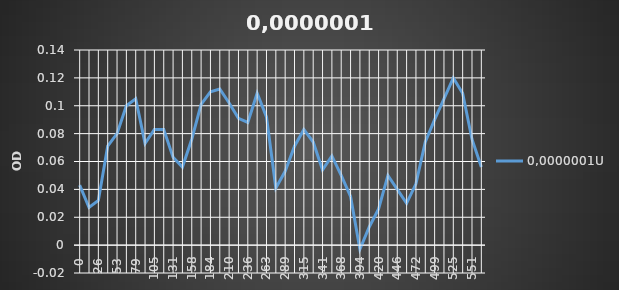
| Category | 0,0000001U |
|---|---|
| 0.0 | 0.043 |
| 13.0 | 0.027 |
| 26.0 | 0.032 |
| 39.0 | 0.071 |
| 53.0 | 0.08 |
| 66.0 | 0.1 |
| 79.0 | 0.105 |
| 92.0 | 0.073 |
| 105.0 | 0.083 |
| 118.0 | 0.083 |
| 131.0 | 0.063 |
| 144.0 | 0.056 |
| 158.0 | 0.076 |
| 171.0 | 0.101 |
| 184.0 | 0.11 |
| 197.0 | 0.112 |
| 210.0 | 0.102 |
| 223.0 | 0.091 |
| 236.0 | 0.088 |
| 249.0 | 0.109 |
| 263.0 | 0.092 |
| 276.0 | 0.041 |
| 289.0 | 0.053 |
| 302.0 | 0.071 |
| 315.0 | 0.083 |
| 328.0 | 0.074 |
| 341.0 | 0.054 |
| 354.0 | 0.064 |
| 368.0 | 0.05 |
| 381.0 | 0.035 |
| 394.0 | -0.003 |
| 407.0 | 0.013 |
| 420.0 | 0.026 |
| 433.0 | 0.05 |
| 446.0 | 0.04 |
| 459.0 | 0.03 |
| 472.0 | 0.044 |
| 486.0 | 0.074 |
| 499.0 | 0.09 |
| 512.0 | 0.105 |
| 525.0 | 0.12 |
| 538.0 | 0.109 |
| 551.0 | 0.076 |
| 564.0 | 0.056 |